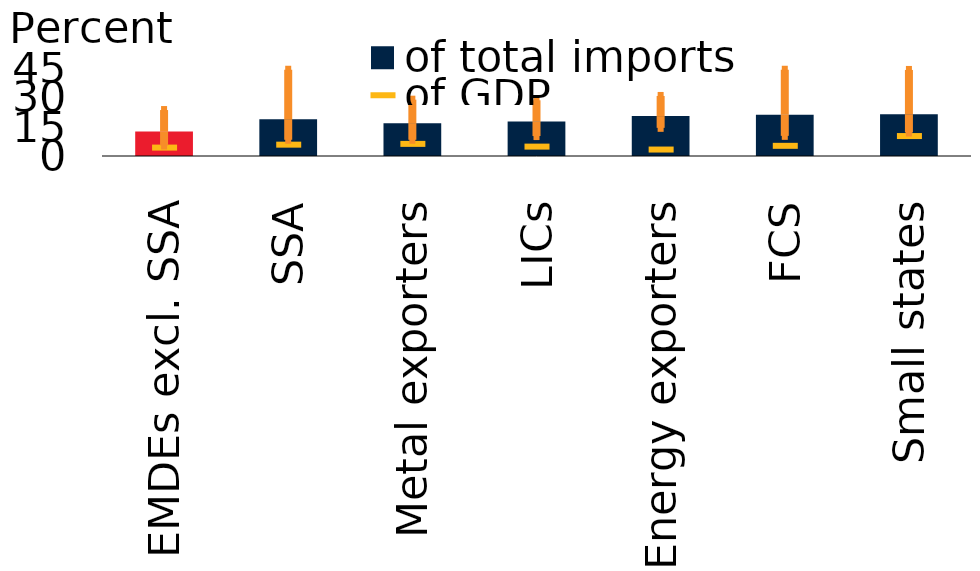
| Category | of total imports |
|---|---|
| EMDEs excl. SSA | 12.5 |
| SSA | 18.8 |
| Metal exporters | 16.8 |
| LICs | 17.6 |
| Energy exporters | 20.4 |
| FCS | 21.1 |
| Small states | 21.3 |